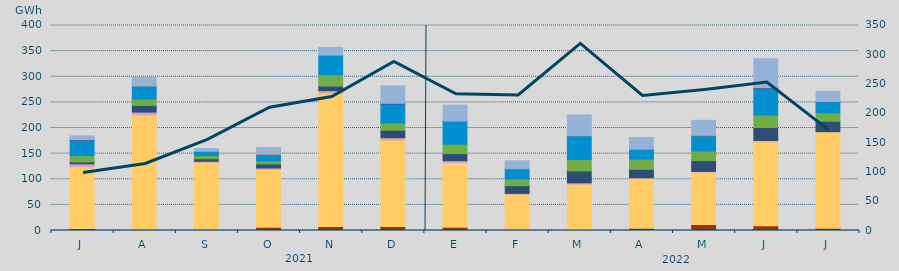
| Category | Carbón | Ciclo Combinado | Cogeneración | Consumo Bombeo | Eólica | Hidráulica | Nuclear | Solar fotovoltaica | Solar térmica | Turbinación bombeo |
|---|---|---|---|---|---|---|---|---|---|---|
| J | 3730 | 121314.8 | 5025 | 3708.5 | 12369.9 | 30030.1 | 967.6 | 0 | 0 | 7404.9 |
| A | 2239.6 | 223722.7 | 5084 | 13015.2 | 12519 | 25553.5 | 0 | 57 | 0 | 16638.9 |
| S | 2513.5 | 130905.6 | 1691.3 | 4917 | 6277.1 | 8332.4 | 87 | 26 | 0 | 5316.1 |
| O | 6371.9 | 113565.2 | 2101.6 | 7861 | 6030.7 | 12656.8 | 0 | 469.9 | 0 | 12892.5 |
| N | 7794.3 | 260394.8 | 4761.9 | 8865.5 | 22305.4 | 37370.7 | 0 | 1030.6 | 0 | 14816.5 |
| D | 7972.1 | 169088.6 | 4082.4 | 14411.7 | 14056.2 | 37289.7 | 1050 | 631.2 | 0 | 33677.5 |
| E | 6570.2 | 126286.6 | 3356.8 | 13716.6 | 18556.1 | 44421.9 | 42 | 928.6 | 0 | 30908.5 |
| F | 2568.1 | 68716.7 | 1177.2 | 14975 | 13257.2 | 19925.5 | 0 | 116 | 0 | 15456.1 |
| M | 1920.2 | 88833.3 | 2368.3 | 23235.2 | 22069.1 | 46579.6 | 0 | 131 | 0 | 40486 |
| A | 4593.5 | 97889.1 | 405.8 | 16475.5 | 19937.3 | 18601.3 | 663.3 | 233.1 | 0 | 22786.5 |
| M | 11875.65 | 102430.975 | 928.85 | 21079.775 | 18647.725 | 29842.925 | 0 | 1098.75 | 0 | 29000.65 |
| J | 9138.825 | 164797.65 | 1808.4 | 25204.95 | 24371.3 | 52553.275 | 599.625 | 596 | 0 | 56106.775 |
| J | 4302 | 188455.5 | 190.325 | 20249.475 | 16437.65 | 21832.925 | 50 | 230.625 | 0 | 19818.55 |